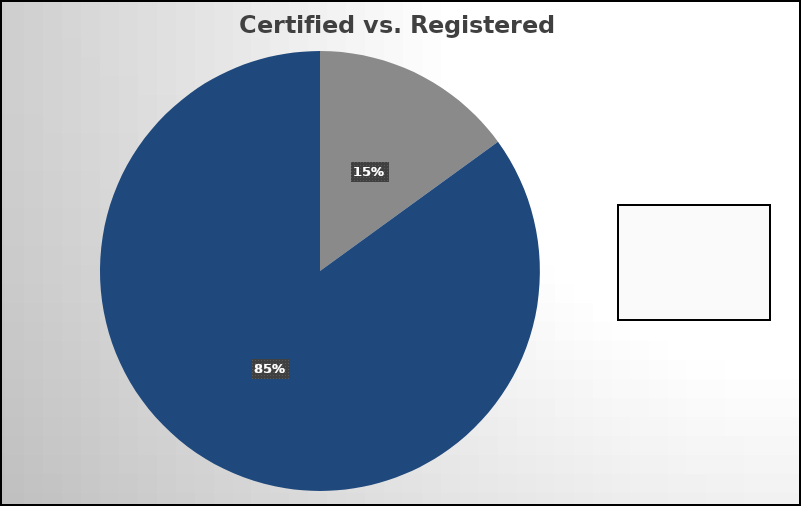
| Category | Series 0 |
|---|---|
| Certified | 3 |
| Registered | 17 |